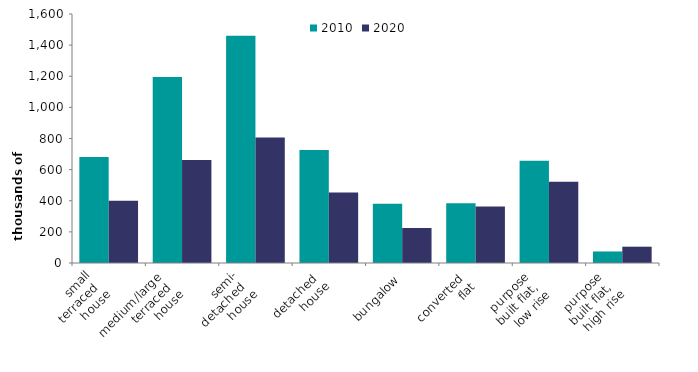
| Category | 2010 | 2020 |
|---|---|---|
| small
 terraced 
house | 681.067 | 400.561 |
| medium/large 
terraced 
house | 1194.398 | 661.401 |
| semi-
detached 
house | 1460.316 | 806.468 |
| detached 
house | 725.376 | 453.216 |
| bungalow | 380.199 | 224.426 |
| converted 
flat | 384.197 | 363.683 |
| purpose 
built flat, 
low rise | 657.692 | 522.181 |
| purpose 
built flat, 
high rise | 74.144 | 104.758 |